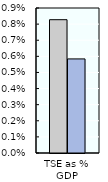
| Category | 2000-02 | 2018-20 |
|---|---|---|
| TSE as % GDP | 0.008 | 0.006 |